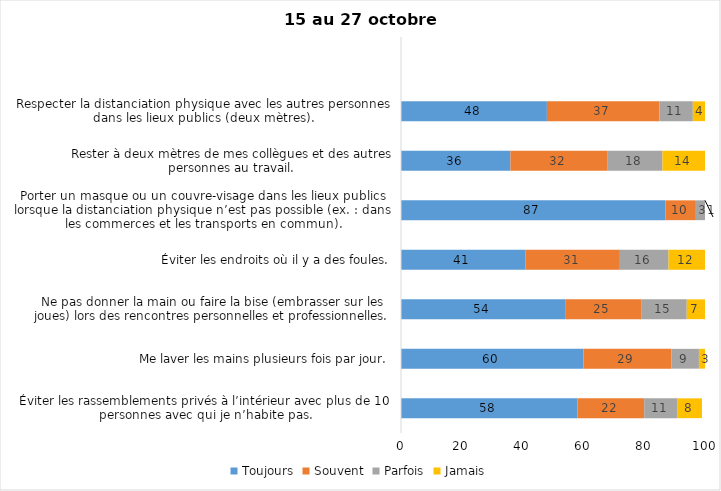
| Category | Toujours | Souvent | Parfois | Jamais |
|---|---|---|---|---|
| Éviter les rassemblements privés à l’intérieur avec plus de 10 personnes avec qui je n’habite pas. | 58 | 22 | 11 | 8 |
| Me laver les mains plusieurs fois par jour. | 60 | 29 | 9 | 3 |
| Ne pas donner la main ou faire la bise (embrasser sur les joues) lors des rencontres personnelles et professionnelles. | 54 | 25 | 15 | 7 |
| Éviter les endroits où il y a des foules. | 41 | 31 | 16 | 12 |
| Porter un masque ou un couvre-visage dans les lieux publics lorsque la distanciation physique n’est pas possible (ex. : dans les commerces et les transports en commun). | 87 | 10 | 3 | 1 |
| Rester à deux mètres de mes collègues et des autres personnes au travail. | 36 | 32 | 18 | 14 |
| Respecter la distanciation physique avec les autres personnes dans les lieux publics (deux mètres). | 48 | 37 | 11 | 4 |